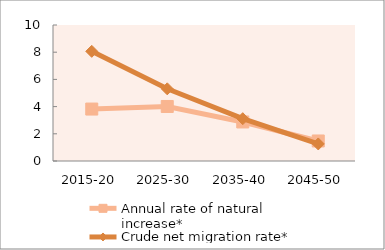
| Category | Annual rate of natural increase* | Crude net migration rate* |
|---|---|---|
| 2015-20 | 3.82 | 8.063 |
| 2025-30 | 4.009 | 5.307 |
| 2035-40 | 2.87 | 3.111 |
| 2045-50 | 1.472 | 1.254 |